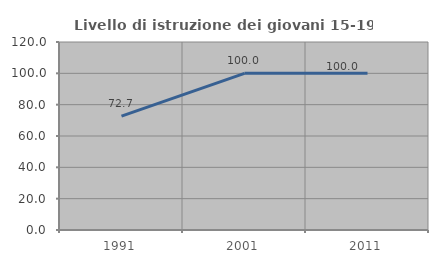
| Category | Livello di istruzione dei giovani 15-19 anni |
|---|---|
| 1991.0 | 72.727 |
| 2001.0 | 100 |
| 2011.0 | 100 |